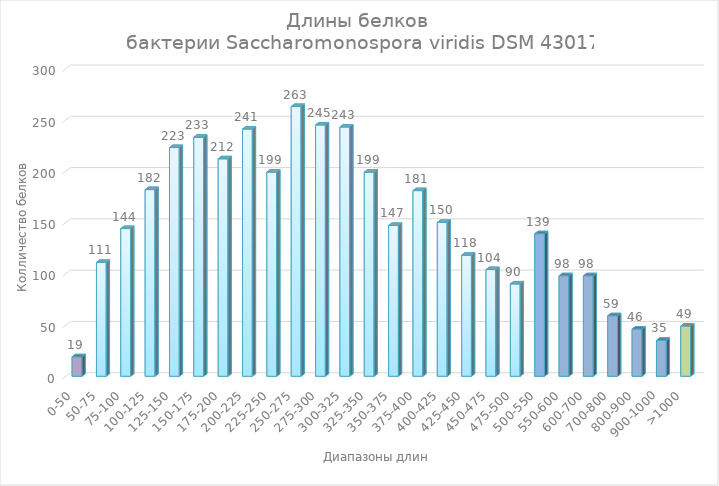
| Category | Series 0 |
|---|---|
| 0-50 | 19 |
| 50-75 | 111 |
| 75-100 | 144 |
| 100-125 | 182 |
| 125-150 | 223 |
| 150-175 | 233 |
| 175-200 | 212 |
| 200-225 | 241 |
| 225-250 | 199 |
| 250-275 | 263 |
| 275-300 | 245 |
| 300-325 | 243 |
| 325-350 | 199 |
| 350-375 | 147 |
| 375-400 | 181 |
| 400-425 | 150 |
| 425-450 | 118 |
| 450-475 | 104 |
| 475-500 | 90 |
| 500-550 | 139 |
| 550-600 | 98 |
| 600-700 | 98 |
| 700-800 | 59 |
| 800-900 | 46 |
| 900-1000 | 35 |
| >1000 | 49 |